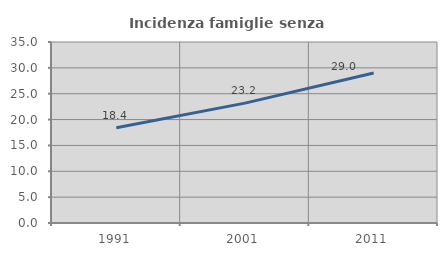
| Category | Incidenza famiglie senza nuclei |
|---|---|
| 1991.0 | 18.414 |
| 2001.0 | 23.177 |
| 2011.0 | 28.992 |